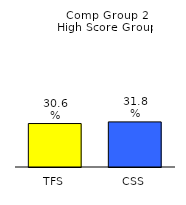
| Category | Series 0 |
|---|---|
| TFS | 0.306 |
| CSS | 0.318 |